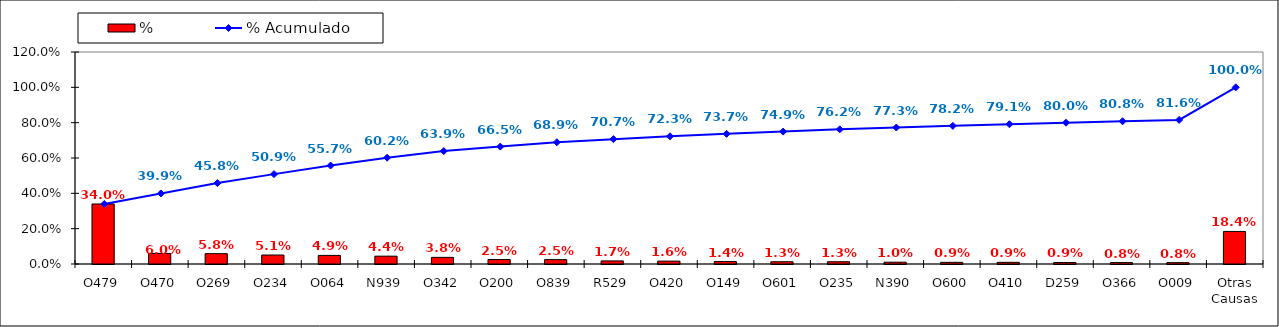
| Category | % |
|---|---|
| O479 | 0.34 |
| O470 | 0.06 |
| O269 | 0.058 |
| O234 | 0.051 |
| O064 | 0.049 |
| N939 | 0.044 |
| O342 | 0.038 |
| O200 | 0.025 |
| O839 | 0.025 |
| R529 | 0.017 |
| O420 | 0.016 |
| O149 | 0.014 |
| O601 | 0.013 |
| O235 | 0.013 |
| N390 | 0.01 |
| O600 | 0.009 |
| O410 | 0.009 |
| D259 | 0.009 |
| O366 | 0.008 |
| O009 | 0.008 |
| Otras Causas | 0.184 |